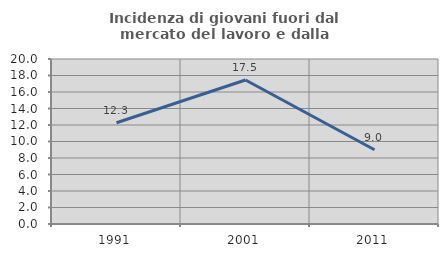
| Category | Incidenza di giovani fuori dal mercato del lavoro e dalla formazione  |
|---|---|
| 1991.0 | 12.27 |
| 2001.0 | 17.46 |
| 2011.0 | 9 |